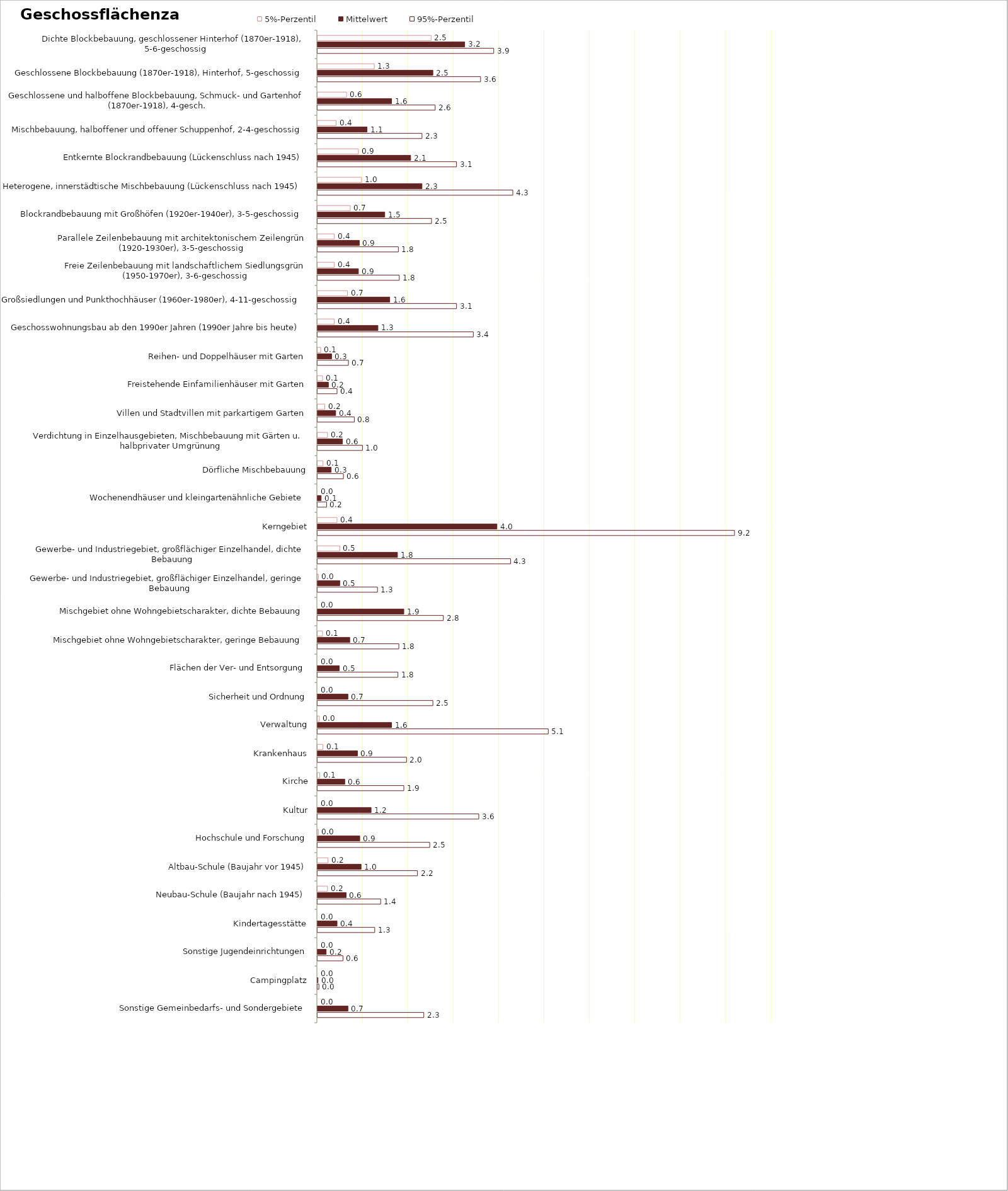
| Category | 5%-Perzentil | Mittelwert | 95%-Perzentil |
|---|---|---|---|
| Dichte Blockbebauung, geschlossener Hinterhof (1870er-1918), 5-6-geschossig | 2.5 | 3.24 | 3.88 |
| Geschlossene Blockbebauung (1870er-1918), Hinterhof, 5-geschossig | 1.25 | 2.54 | 3.59 |
| Geschlossene und halboffene Blockbebauung, Schmuck- und Gartenhof (1870er-1918), 4-gesch. | 0.64 | 1.63 | 2.59 |
| Mischbebauung, halboffener und offener Schuppenhof, 2-4-geschossig | 0.41 | 1.09 | 2.3 |
| Entkernte Blockrandbebauung (Lückenschluss nach 1945) | 0.9 | 2.05 | 3.06 |
| Heterogene, innerstädtische Mischbebauung (Lückenschluss nach 1945) | 0.97 | 2.3 | 4.3 |
| Blockrandbebauung mit Großhöfen (1920er-1940er), 3-5-geschossig | 0.72 | 1.48 | 2.51 |
| Parallele Zeilenbebauung mit architektonischem Zeilengrün (1920-1930er), 3-5-geschossig | 0.37 | 0.92 | 1.78 |
| Freie Zeilenbebauung mit landschaftlichem Siedlungsgrün (1950-1970er), 3-6-geschossig | 0.37 | 0.9 | 1.8 |
| Großsiedlungen und Punkthochhäuser (1960er-1980er), 4-11-geschossig | 0.66 | 1.59 | 3.06 |
| Geschosswohnungsbau ab den 1990er Jahren (1990er Jahre bis heute) | 0.37 | 1.33 | 3.43 |
| Reihen- und Doppelhäuser mit Garten | 0.07 | 0.31 | 0.68 |
| Freistehende Einfamilienhäuser mit Garten | 0.11 | 0.24 | 0.43 |
| Villen und Stadtvillen mit parkartigem Garten | 0.16 | 0.4 | 0.81 |
| Verdichtung in Einzelhausgebieten, Mischbebauung mit Gärten u. halbprivater Umgrünung | 0.22 | 0.55 | 0.99 |
| Dörfliche Mischbebauung | 0.12 | 0.3 | 0.57 |
| Wochenendhäuser und kleingartenähnliche Gebiete | 0 | 0.08 | 0.2 |
| Kerngebiet | 0.43 | 3.95 | 9.18 |
| Gewerbe- und Industriegebiet, großflächiger Einzelhandel, dichte Bebauung | 0.49 | 1.76 | 4.25 |
| Gewerbe- und Industriegebiet, großflächiger Einzelhandel, geringe Bebauung | 0.02 | 0.49 | 1.32 |
| Mischgebiet ohne Wohngebietscharakter, dichte Bebauung | 0 | 1.9 | 2.77 |
| Mischgebiet ohne Wohngebietscharakter, geringe Bebauung | 0.11 | 0.71 | 1.79 |
| Flächen der Ver- und Entsorgung | 0 | 0.48 | 1.77 |
| Sicherheit und Ordnung | 0 | 0.67 | 2.54 |
| Verwaltung | 0.04 | 1.63 | 5.08 |
| Krankenhaus | 0.12 | 0.88 | 1.96 |
| Kirche | 0.05 | 0.6 | 1.9 |
| Kultur | 0 | 1.18 | 3.55 |
| Hochschule und Forschung | 0.02 | 0.93 | 2.47 |
| Altbau-Schule (Baujahr vor 1945) | 0.23 | 0.96 | 2.2 |
| Neubau-Schule (Baujahr nach 1945) | 0.22 | 0.63 | 1.39 |
| Kindertagesstätte | 0 | 0.43 | 1.26 |
| Sonstige Jugendeinrichtungen | 0 | 0.19 | 0.56 |
| Campingplatz | 0 | 0.01 | 0.03 |
| Sonstige Gemeinbedarfs- und Sondergebiete | 0 | 0.67 | 2.34 |